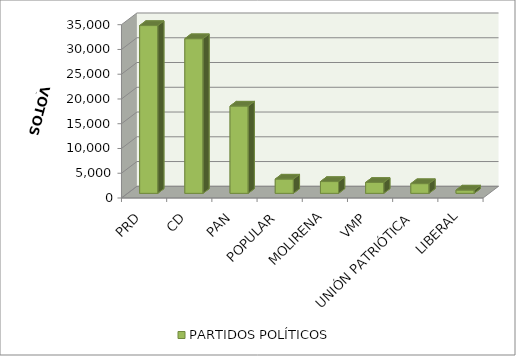
| Category | PARTIDOS POLÍTICOS |
|---|---|
| PRD | 33887 |
| CD | 31236 |
| PAN | 17624 |
| POPULAR | 2881 |
| MOLIRENA | 2381 |
| VMP | 2206 |
| UNIÓN PATRIÓTICA | 1963 |
| LIBERAL | 667 |